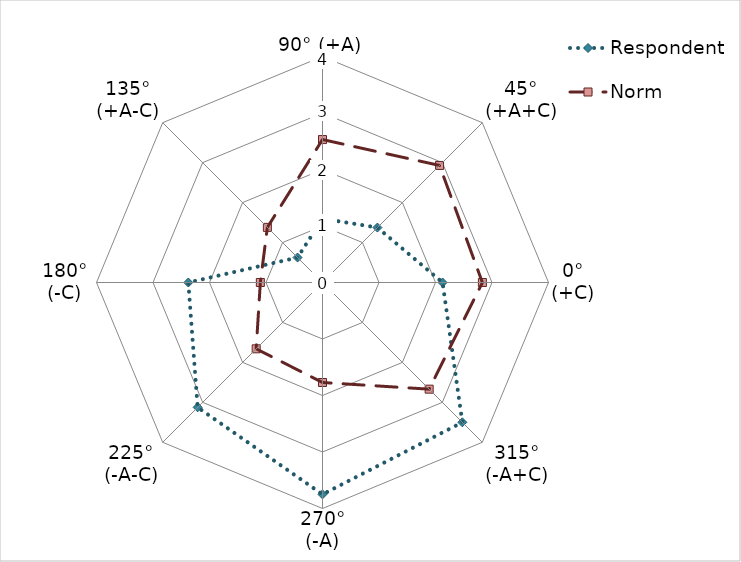
| Category | Respondent | Norm | Overall Vector |
|---|---|---|---|
| 90° (+A) | 1.13 | 2.53 |  |
| 45°
(+A+C) | 1.375 | 2.93 |  |
| 0°
(+C) | 2.125 | 2.83 |  |
| 315°
(-A+C) | 3.5 | 2.67 |  |
| 270°
(-A) | 3.75 | 1.77 |  |
| 225°
(-A-C) | 3.125 | 1.66 |  |
| 180°
(-C) | 2.375 | 1.1 |  |
| 135°
(+A-C) | 0.625 | 1.38 |  |